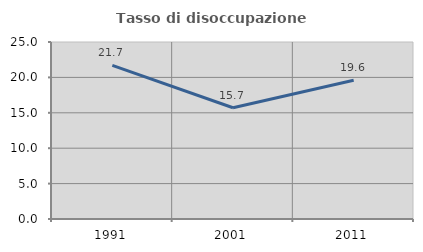
| Category | Tasso di disoccupazione giovanile  |
|---|---|
| 1991.0 | 21.698 |
| 2001.0 | 15.714 |
| 2011.0 | 19.608 |